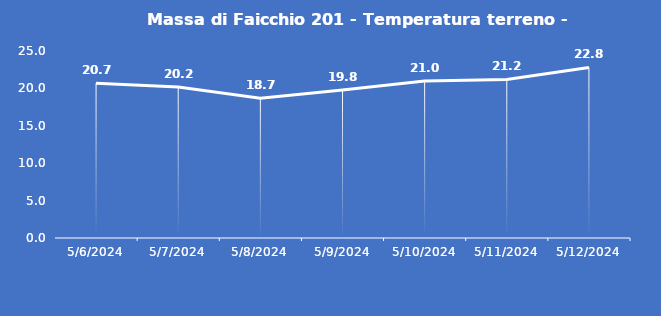
| Category | Massa di Faicchio 201 - Temperatura terreno - Grezzo (°C) |
|---|---|
| 5/6/24 | 20.7 |
| 5/7/24 | 20.2 |
| 5/8/24 | 18.7 |
| 5/9/24 | 19.8 |
| 5/10/24 | 21 |
| 5/11/24 | 21.2 |
| 5/12/24 | 22.8 |